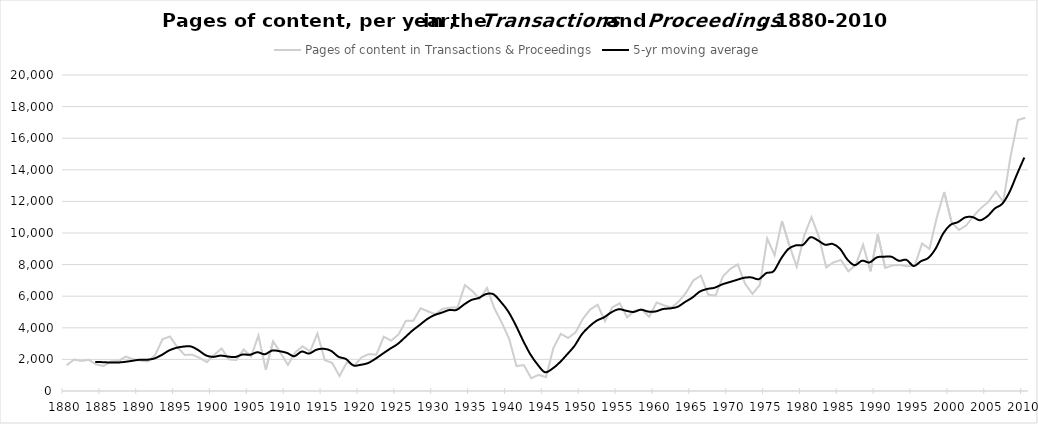
| Category | Pages of content in Transactions & Proceedings |
|---|---|
| 1880.0 | 1631.5 |
| 1881.0 | 1988 |
| 1882.0 | 1901.5 |
| 1883.0 | 1974 |
| 1884.0 | 1685 |
| 1885.0 | 1581 |
| 1886.0 | 1874 |
| 1887.0 | 1887 |
| 1888.0 | 2181 |
| 1889.0 | 2015.5 |
| 1890.0 | 1924.5 |
| 1891.0 | 1867.5 |
| 1892.0 | 2279 |
| 1893.0 | 3281.5 |
| 1894.0 | 3450 |
| 1895.0 | 2776 |
| 1896.0 | 2279.5 |
| 1897.0 | 2302.5 |
| 1898.0 | 2103 |
| 1899.0 | 1828 |
| 1900.0 | 2281 |
| 1901.0 | 2693 |
| 1902.0 | 2000 |
| 1903.0 | 1953.5 |
| 1904.0 | 2631.5 |
| 1905.0 | 2181 |
| 1906.0 | 3506 |
| 1907.0 | 1345 |
| 1908.0 | 3146 |
| 1909.0 | 2416 |
| 1910.0 | 1651 |
| 1911.0 | 2441 |
| 1912.0 | 2827 |
| 1913.0 | 2503 |
| 1914.0 | 3634 |
| 1915.0 | 1957 |
| 1916.0 | 1779 |
| 1917.0 | 947 |
| 1918.0 | 1814 |
| 1919.0 | 1608 |
| 1920.0 | 2132 |
| 1921.0 | 2335 |
| 1922.0 | 2298 |
| 1923.0 | 3441 |
| 1924.0 | 3183 |
| 1925.0 | 3576 |
| 1926.0 | 4438 |
| 1927.0 | 4444 |
| 1928.0 | 5238 |
| 1929.0 | 5035 |
| 1930.0 | 4867 |
| 1931.0 | 5200 |
| 1932.0 | 5276 |
| 1933.0 | 5281 |
| 1934.0 | 6704 |
| 1935.0 | 6331 |
| 1936.0 | 5834 |
| 1937.0 | 6522 |
| 1938.0 | 5233 |
| 1939.0 | 4323 |
| 1940.0 | 3309 |
| 1941.0 | 1583 |
| 1942.0 | 1636 |
| 1943.0 | 807 |
| 1944.0 | 1022 |
| 1945.0 | 877 |
| 1946.0 | 2717 |
| 1947.0 | 3617 |
| 1948.0 | 3357 |
| 1949.0 | 3706 |
| 1950.0 | 4566 |
| 1951.0 | 5160 |
| 1952.0 | 5458 |
| 1953.0 | 4422 |
| 1954.0 | 5298 |
| 1955.0 | 5555 |
| 1956.0 | 4660 |
| 1957.0 | 5071 |
| 1958.0 | 5153 |
| 1959.0 | 4695 |
| 1960.0 | 5600 |
| 1961.0 | 5420 |
| 1962.0 | 5282 |
| 1963.0 | 5655 |
| 1964.0 | 6230 |
| 1965.0 | 7006 |
| 1966.0 | 7301 |
| 1967.0 | 6098 |
| 1968.0 | 6046 |
| 1969.0 | 7262 |
| 1970.0 | 7731 |
| 1971.0 | 8011 |
| 1972.0 | 6789 |
| 1973.0 | 6145 |
| 1974.0 | 6711 |
| 1975.0 | 9648 |
| 1976.0 | 8594 |
| 1977.0 | 10755 |
| 1978.0 | 9227 |
| 1979.0 | 7862 |
| 1980.0 | 9818 |
| 1981.0 | 11001 |
| 1982.0 | 9768 |
| 1983.0 | 7821 |
| 1984.0 | 8143 |
| 1985.0 | 8294 |
| 1986.0 | 7577 |
| 1987.0 | 7974 |
| 1988.0 | 9256 |
| 1989.0 | 7577 |
| 1990.0 | 9901 |
| 1991.0 | 7791 |
| 1992.0 | 7951 |
| 1993.0 | 7977 |
| 1994.0 | 7897 |
| 1995.0 | 7938 |
| 1996.0 | 9333 |
| 1997.0 | 8994 |
| 1998.0 | 10993 |
| 1999.0 | 12596 |
| 2000.0 | 10676 |
| 2001.0 | 10189 |
| 2002.0 | 10487 |
| 2003.0 | 11078 |
| 2004.0 | 11591 |
| 2005.0 | 11968 |
| 2006.0 | 12629 |
| 2007.0 | 11961 |
| 2008.0 | 14848 |
| 2009.0 | 17154 |
| 2010.0 | 17295 |